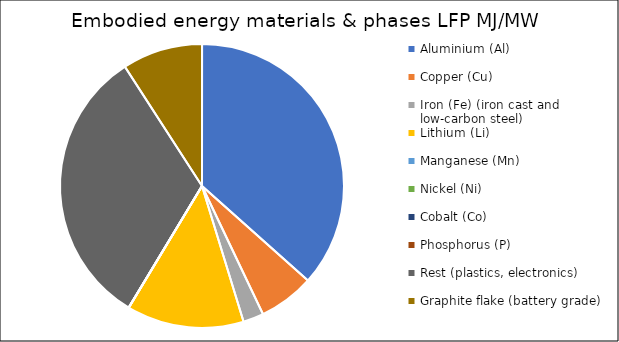
| Category | Embodied energy materials & phases LFP |
|---|---|
| Aluminium (Al) | 156845.865 |
| Copper (Cu) | 27147.285 |
| Iron (Fe) (iron cast and low-carbon steel) | 10029.096 |
| Lithium (Li) | 57236.3 |
| Manganese (Mn) | 0 |
| Nickel (Ni) | 0 |
| Cobalt (Co) | 0 |
| Phosphorus (P) | 0 |
| Rest (plastics, electronics) | 138151.282 |
| Graphite flake (battery grade) | 39195.2 |